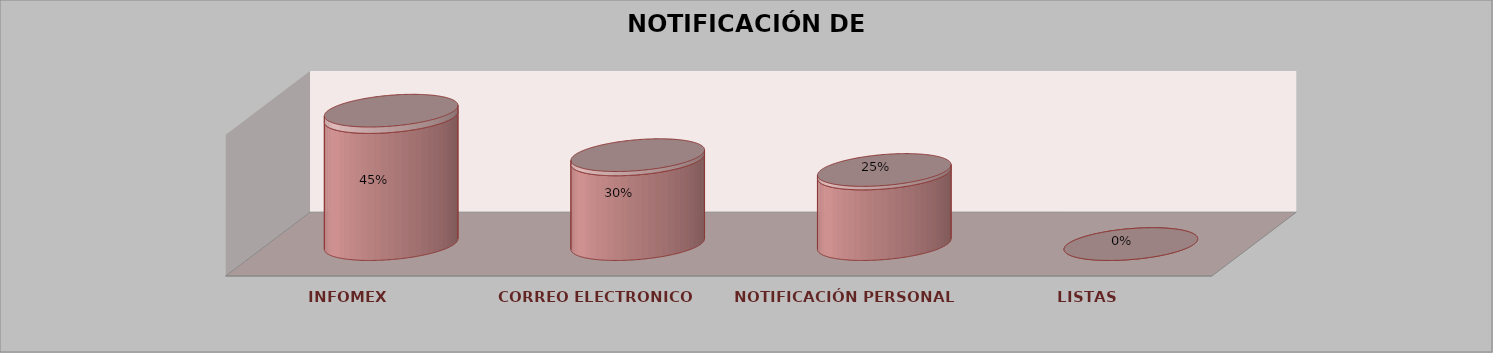
| Category | Series 0 | Series 1 | Series 2 | Series 3 | Series 4 |
|---|---|---|---|---|---|
| INFOMEX |  |  |  | 9 | 0.45 |
| CORREO ELECTRONICO |  |  |  | 6 | 0.3 |
| NOTIFICACIÓN PERSONAL |  |  |  | 5 | 0.25 |
| LISTAS |  |  |  | 0 | 0 |